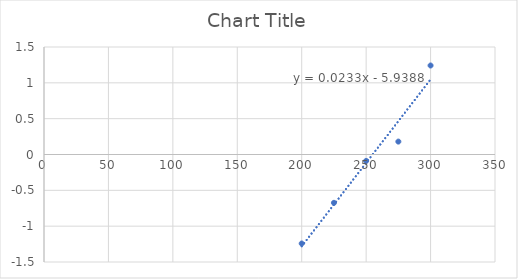
| Category | Series 0 |
|---|---|
| 200.0 | -1.242 |
| 225.0 | -0.674 |
| 250.0 | -0.09 |
| 275.0 | 0.18 |
| 300.0 | 1.242 |